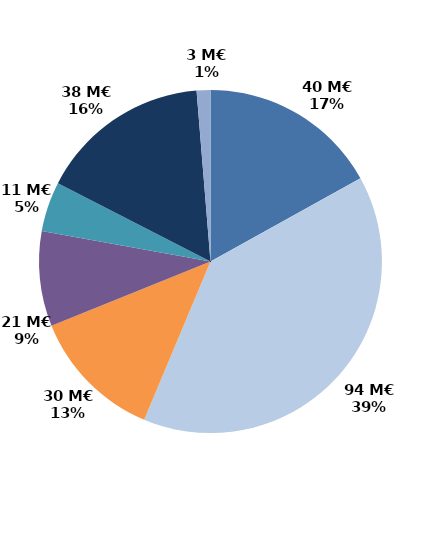
| Category | Series 0 |
|---|---|
| Accueil et information (CEP 1) | 40.297 |
| Accompagnement renforcé (CEP 2 et 3) | 93.742 |
| Suivi | 29.919 |
| Missions locales | 21.304 |
| CSP | 11.184 |
| Aide à la création d'entreprise | 38.453 |
| Aide à l'insertion | 3.087 |